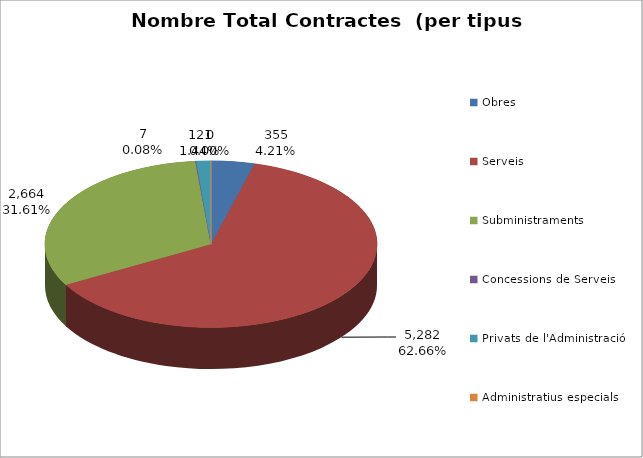
| Category | Nombre Total Contractes |
|---|---|
| Obres | 355 |
| Serveis | 5282 |
| Subministraments | 2664 |
| Concessions de Serveis | 7 |
| Privats de l'Administració | 121 |
| Administratius especials | 0 |